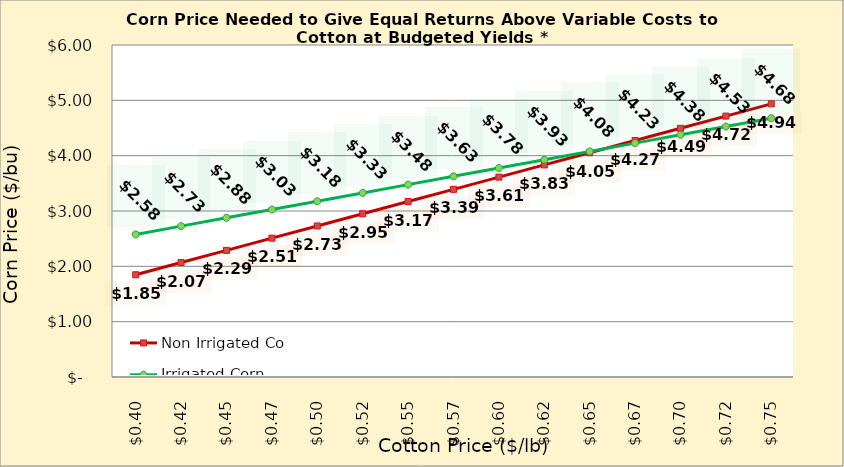
| Category | Non Irrigated Corn | Irrigated Corn |
|---|---|---|
| 0.3949999999999998 | 1.847 | 2.576 |
| 0.4199999999999998 | 2.068 | 2.726 |
| 0.44499999999999984 | 2.289 | 2.876 |
| 0.46999999999999986 | 2.509 | 3.026 |
| 0.4949999999999999 | 2.73 | 3.176 |
| 0.5199999999999999 | 2.95 | 3.326 |
| 0.5449999999999999 | 3.171 | 3.476 |
| 0.57 | 3.392 | 3.626 |
| 0.595 | 3.612 | 3.776 |
| 0.62 | 3.833 | 3.926 |
| 0.645 | 4.053 | 4.076 |
| 0.67 | 4.274 | 4.226 |
| 0.6950000000000001 | 4.494 | 4.376 |
| 0.7200000000000001 | 4.715 | 4.526 |
| 0.7450000000000001 | 4.936 | 4.676 |